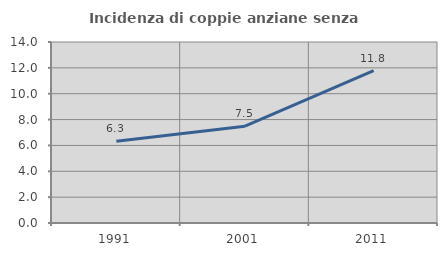
| Category | Incidenza di coppie anziane senza figli  |
|---|---|
| 1991.0 | 6.329 |
| 2001.0 | 7.491 |
| 2011.0 | 11.787 |